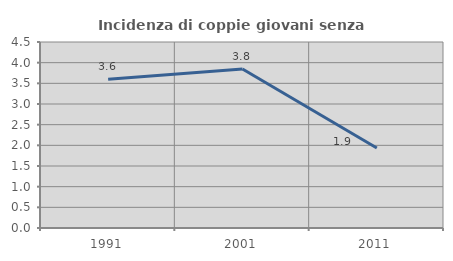
| Category | Incidenza di coppie giovani senza figli |
|---|---|
| 1991.0 | 3.601 |
| 2001.0 | 3.846 |
| 2011.0 | 1.935 |